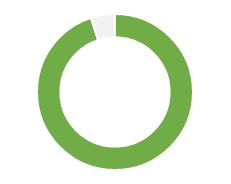
| Category | Series 0 |
|---|---|
| 0 | 0 |
| 1 | 0 |
| 2 | 0.95 |
| 3 | 0.05 |